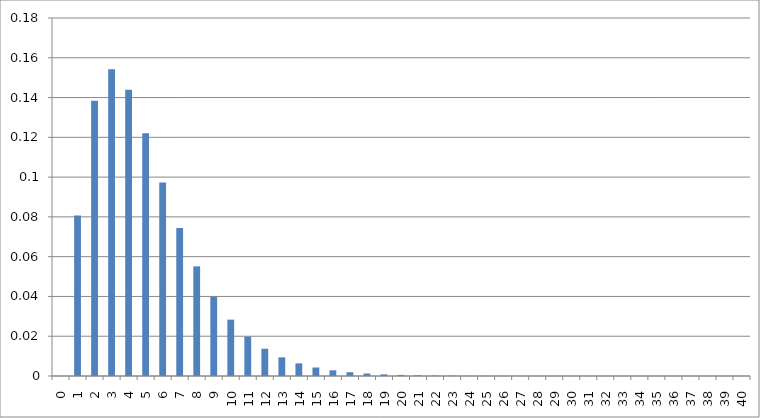
| Category | Series 0 |
|---|---|
| 0.0 | 0 |
| 1.0 | 0.081 |
| 2.0 | 0.138 |
| 3.0 | 0.154 |
| 4.0 | 0.144 |
| 5.0 | 0.122 |
| 6.0 | 0.097 |
| 7.0 | 0.074 |
| 8.0 | 0.055 |
| 9.0 | 0.04 |
| 10.0 | 0.028 |
| 11.0 | 0.02 |
| 12.0 | 0.014 |
| 13.0 | 0.009 |
| 14.0 | 0.006 |
| 15.0 | 0.004 |
| 16.0 | 0.003 |
| 17.0 | 0.002 |
| 18.0 | 0.001 |
| 19.0 | 0.001 |
| 20.0 | 0.001 |
| 21.0 | 0 |
| 22.0 | 0 |
| 23.0 | 0 |
| 24.0 | 0 |
| 25.0 | 0 |
| 26.0 | 0 |
| 27.0 | 0 |
| 28.0 | 0 |
| 29.0 | 0 |
| 30.0 | 0 |
| 31.0 | 0 |
| 32.0 | 0 |
| 33.0 | 0 |
| 34.0 | 0 |
| 35.0 | 0 |
| 36.0 | 0 |
| 37.0 | 0 |
| 38.0 | 0 |
| 39.0 | 0 |
| 40.0 | 0 |